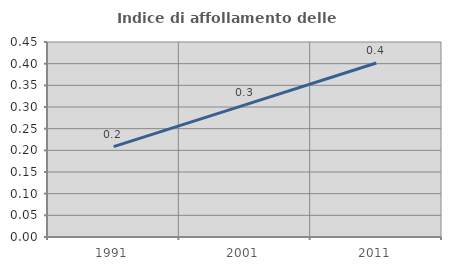
| Category | Indice di affollamento delle abitazioni  |
|---|---|
| 1991.0 | 0.209 |
| 2001.0 | 0.305 |
| 2011.0 | 0.402 |